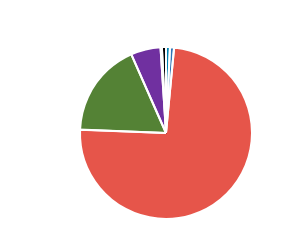
| Category | Series 0 |
|---|---|
| PC | 295 |
| MC | 310 |
| CAR | 29770 |
| LGV | 7136 |
| OGV1 | 2248 |
| OGV2 | 103 |
| PSV | 306 |